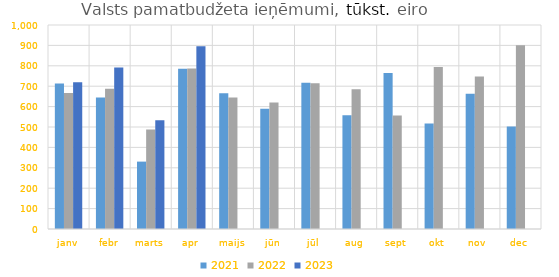
| Category | 2021 | 2022 | 2023 |
|---|---|---|---|
| janv | 713014.632 | 666661.352 | 719939.35 |
| febr | 644814.957 | 687779.931 | 791517.955 |
| marts | 330339.758 | 487592.334 | 533224.214 |
| apr | 785719.324 | 787062.79 | 895993.736 |
| maijs | 665234.221 | 644004.073 | 0 |
| jūn | 589166.177 | 620273.485 | 0 |
| jūl | 717458.088 | 713962.301 | 0 |
| aug | 557138.062 | 685067.765 | 0 |
| sept | 764496.897 | 556332.319 | 0 |
| okt | 516906.965 | 794230.202 | 0 |
| nov | 662718.632 | 747989.336 | 0 |
| dec | 502474.488 | 900960.999 | 0 |